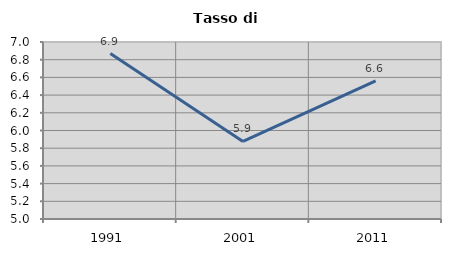
| Category | Tasso di disoccupazione   |
|---|---|
| 1991.0 | 6.869 |
| 2001.0 | 5.876 |
| 2011.0 | 6.56 |